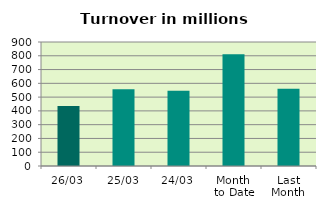
| Category | Series 0 |
|---|---|
| 26/03 | 436.034 |
| 25/03 | 557.712 |
| 24/03 | 547.002 |
| Month 
to Date | 811.701 |
| Last
Month | 561.452 |